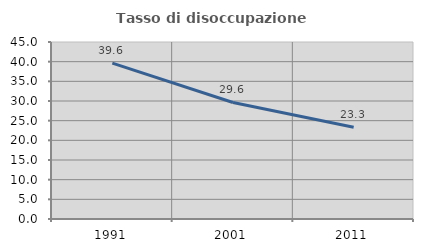
| Category | Tasso di disoccupazione giovanile  |
|---|---|
| 1991.0 | 39.623 |
| 2001.0 | 29.63 |
| 2011.0 | 23.333 |